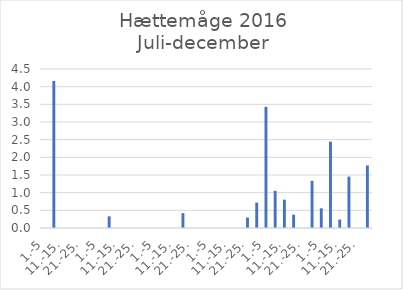
| Category | Series 0 |
|---|---|
| 1.-5 | 0 |
| 6.-10. | 4.162 |
| 11.-15. | 0 |
| 16.-20. | 0 |
| 21.-25. | 0 |
| 26.-31. | 0 |
| 1.-5 | 0 |
| 6.-10. | 0.331 |
| 11.-15. | 0 |
| 16.-20. | 0 |
| 21.-25. | 0 |
| 26.-31. | 0 |
| 1.-5 | 0 |
| 6.-10. | 0 |
| 11.-15. | 0 |
| 16.-20. | 0.42 |
| 21.-25. | 0 |
| 26.-30. | 0 |
| 1.-5 | 0 |
| 6.-10. | 0 |
| 11.-15. | 0 |
| 16.-20. | 0 |
| 21.-25. | 0.295 |
| 26.-31. | 0.719 |
| 1.-5 | 3.429 |
| 6.-10. | 1.053 |
| 11.-15. | 0.802 |
| 16.-20. | 0.377 |
| 21.-25. | 0 |
| 26.-30. | 1.335 |
| 1.-5 | 0.557 |
| 6.-10. | 2.444 |
| 11.-15. | 0.239 |
| 16.-20. | 1.455 |
| 21.-25. | 0 |
| 26.-31. | 1.77 |